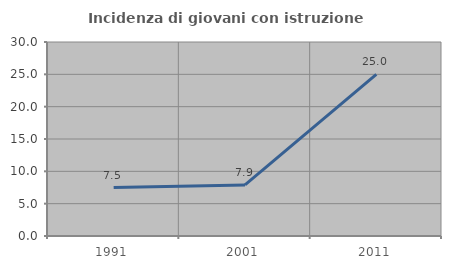
| Category | Incidenza di giovani con istruzione universitaria |
|---|---|
| 1991.0 | 7.5 |
| 2001.0 | 7.895 |
| 2011.0 | 25 |